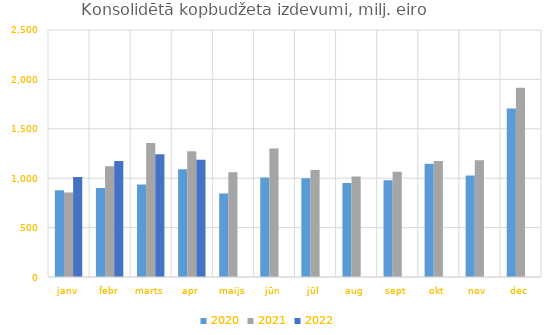
| Category | 2020 | 2021 | 2022 |
|---|---|---|---|
| janv | 878360.095 | 855571.821 | 1011780.956 |
| febr | 900276.14 | 1120070.85 | 1174583.857 |
| marts | 935266.915 | 1355758.12 | 1242068.533 |
| apr | 1090965.926 | 1273663.147 | 1187341.457 |
| maijs | 845625.072 | 1060453.286 | 0 |
| jūn | 1007637.852 | 1299852.065 | 0 |
| jūl | 999723.1 | 1081981.296 | 0 |
| aug | 951921.221 | 1017502.093 | 0 |
| sept | 978775.82 | 1064391.019 | 0 |
| okt | 1146014.897 | 1173896.626 | 0 |
| nov | 1028398.84 | 1182055.554 | 0 |
| dec | 1706433.895 | 1915376.849 | 0 |